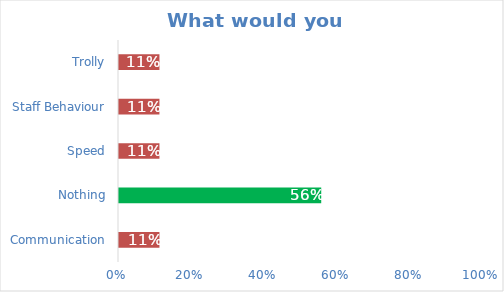
| Category | Series 0 |
|---|---|
| Communication | 0.111 |
| Nothing | 0.556 |
| Speed | 0.111 |
| Staff Behaviour | 0.111 |
| Trolly | 0.111 |